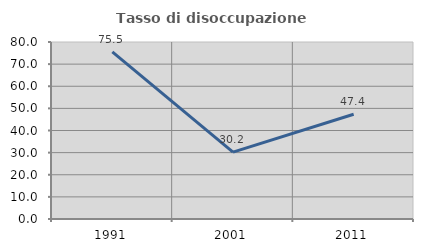
| Category | Tasso di disoccupazione giovanile  |
|---|---|
| 1991.0 | 75.497 |
| 2001.0 | 30.233 |
| 2011.0 | 47.368 |